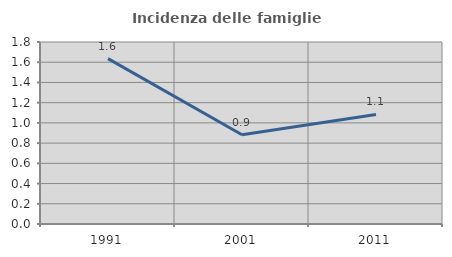
| Category | Incidenza delle famiglie numerose |
|---|---|
| 1991.0 | 1.636 |
| 2001.0 | 0.882 |
| 2011.0 | 1.083 |